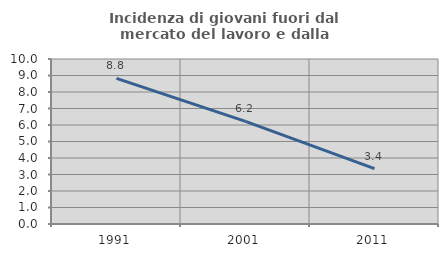
| Category | Incidenza di giovani fuori dal mercato del lavoro e dalla formazione  |
|---|---|
| 1991.0 | 8.824 |
| 2001.0 | 6.218 |
| 2011.0 | 3.352 |